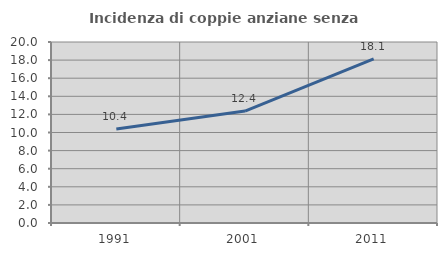
| Category | Incidenza di coppie anziane senza figli  |
|---|---|
| 1991.0 | 10.385 |
| 2001.0 | 12.372 |
| 2011.0 | 18.146 |